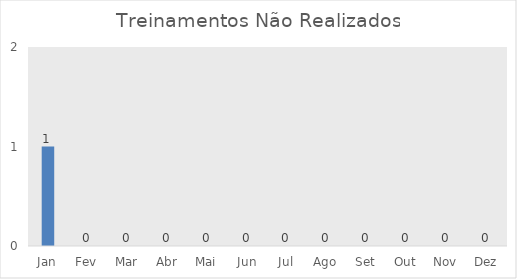
| Category | Treinamentos Não Realizados |
|---|---|
| Jan | 1 |
| Fev | 0 |
| Mar | 0 |
| Abr | 0 |
| Mai | 0 |
| Jun | 0 |
| Jul | 0 |
| Ago | 0 |
| Set | 0 |
| Out | 0 |
| Nov | 0 |
| Dez | 0 |